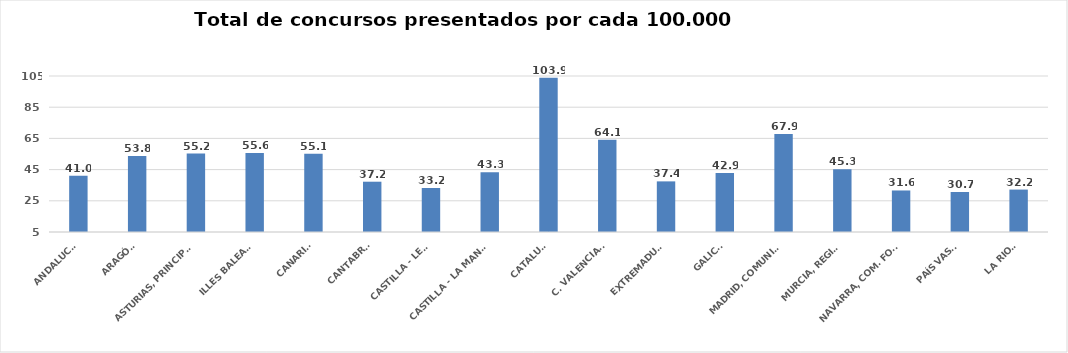
| Category | Series 0 |
|---|---|
| ANDALUCÍA | 40.999 |
| ARAGÓN | 53.758 |
| ASTURIAS, PRINCIPADO | 55.241 |
| ILLES BALEARS | 55.581 |
| CANARIAS | 55.104 |
| CANTABRIA | 37.239 |
| CASTILLA - LEÓN | 33.212 |
| CASTILLA - LA MANCHA | 43.344 |
| CATALUÑA | 103.88 |
| C. VALENCIANA | 64.143 |
| EXTREMADURA | 37.449 |
| GALICIA | 42.855 |
| MADRID, COMUNIDAD | 67.878 |
| MURCIA, REGIÓN | 45.304 |
| NAVARRA, COM. FORAL | 31.621 |
| PAÍS VASCO | 30.659 |
| LA RIOJA | 32.198 |